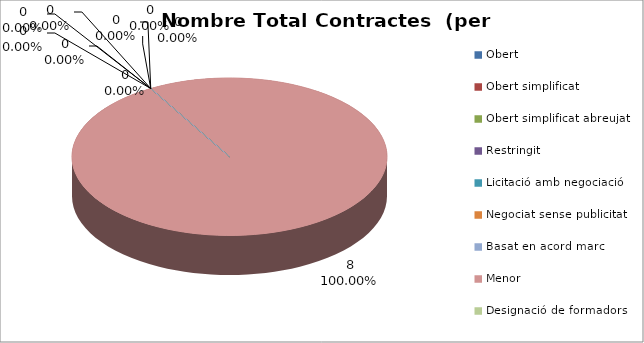
| Category | Nombre Total Contractes |
|---|---|
| Obert | 0 |
| Obert simplificat | 0 |
| Obert simplificat abreujat | 0 |
| Restringit | 0 |
| Licitació amb negociació | 0 |
| Negociat sense publicitat | 0 |
| Basat en acord marc | 0 |
| Menor | 8 |
| Designació de formadors | 0 |